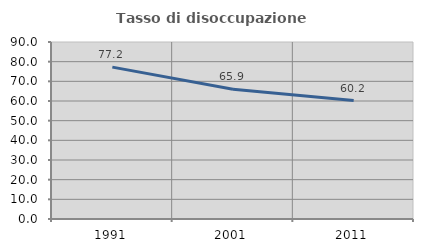
| Category | Tasso di disoccupazione giovanile  |
|---|---|
| 1991.0 | 77.215 |
| 2001.0 | 65.942 |
| 2011.0 | 60.194 |